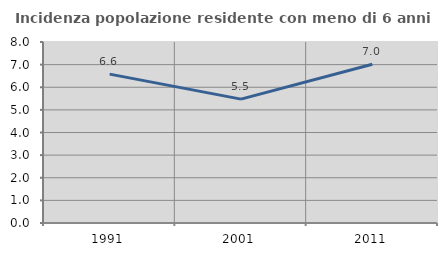
| Category | Incidenza popolazione residente con meno di 6 anni |
|---|---|
| 1991.0 | 6.579 |
| 2001.0 | 5.475 |
| 2011.0 | 7.015 |